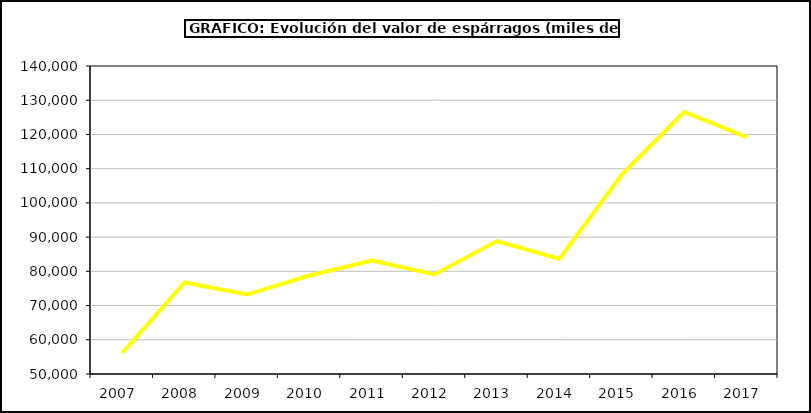
| Category | Valor |
|---|---|
| 2007.0 | 56130.977 |
| 2008.0 | 76743.638 |
| 2009.0 | 73215.082 |
| 2010.0 | 78781.277 |
| 2011.0 | 83128.666 |
| 2012.0 | 79103.985 |
| 2013.0 | 88833.6 |
| 2014.0 | 83613.501 |
| 2015.0 | 108300 |
| 2016.0 | 126575 |
| 2017.0 | 119203.294 |